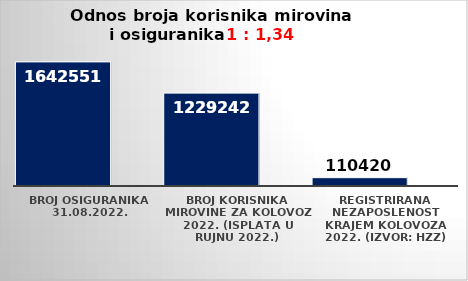
| Category | Series 0 | Series 1 |
|---|---|---|
| Broj osiguranika 31.08.2022. | 1642551 |  |
| Broj korisnika mirovine za kolovoz 2022. (isplata u rujnu 2022.) | 1229242 |  |
| Registrirana nezaposlenost krajem kolovoza 2022. (izvor: HZZ) | 110420 |  |